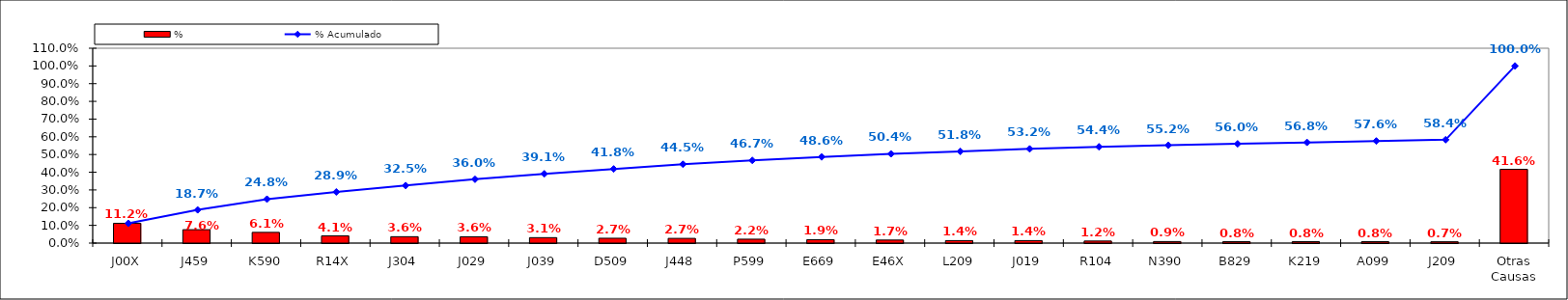
| Category | % |
|---|---|
| J00X | 0.112 |
| J459 | 0.076 |
| K590 | 0.061 |
| R14X | 0.041 |
| J304 | 0.036 |
| J029 | 0.036 |
| J039 | 0.031 |
| D509 | 0.027 |
| J448 | 0.027 |
| P599 | 0.022 |
| E669 | 0.019 |
| E46X | 0.017 |
| L209 | 0.014 |
| J019 | 0.014 |
| R104 | 0.012 |
| N390 | 0.009 |
| B829 | 0.008 |
| K219 | 0.008 |
| A099 | 0.008 |
| J209 | 0.007 |
| Otras Causas | 0.416 |